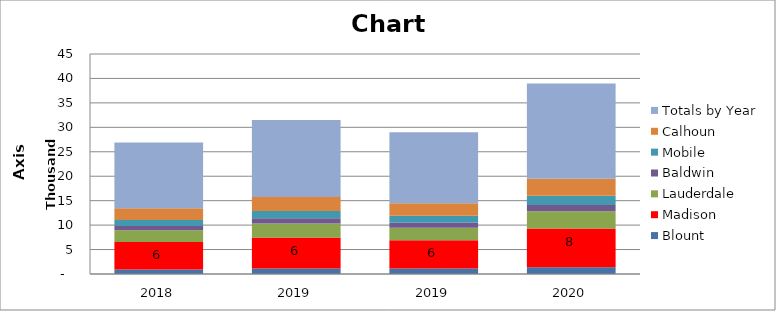
| Category | Blount | Madison | Lauderdale | Baldwin | Mobile | Calhoun | Totals by Year |
|---|---|---|---|---|---|---|---|
| 2018.0 | 930 | 5600 | 2409 | 869 | 1250 | 2389 | 13447 |
| 2019.0 | 1116 | 6338 | 2890 | 1042 | 1504 | 2866 | 15756 |
| 2019.0 | 1105 | 5775 | 2584 | 1044 | 1425 | 2564 | 14497 |
| 2020.0 | 1392 | 7890 | 3536 | 1303 | 1860 | 3507 | 19488 |